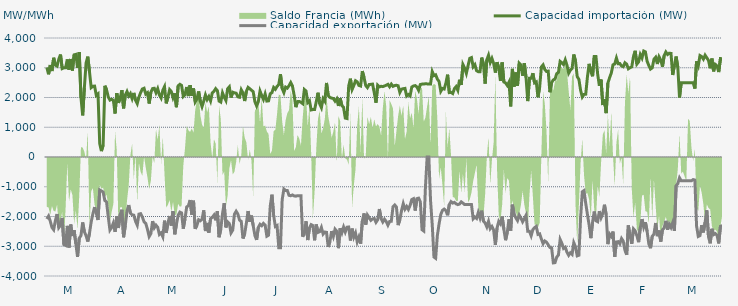
| Category | Capacidad importación (MW) | Capacidad exportación (MW) |
|---|---|---|
| 0 | 3009.542 | -2084.208 |
| 1900-01-01 | 2780.333 | -1987.25 |
| 1900-01-02 | 3090.792 | -2157.25 |
| 1900-01-03 | 2889.375 | -2369.167 |
| 1900-01-04 | 3335.375 | -2443.917 |
| 1900-01-05 | 3086.625 | -2135.417 |
| 1900-01-06 | 3054 | -1916.417 |
| 1900-01-07 | 3285.417 | -2373 |
| 1900-01-08 | 3443.292 | -2289.333 |
| 1900-01-09 | 2971.208 | -2047.917 |
| 1900-01-10 | 2996.292 | -2944.458 |
| 1900-01-11 | 3001.167 | -2971.542 |
| 1900-01-12 | 3281.375 | -2314.833 |
| 1900-01-13 | 2936.042 | -3043.167 |
| 1900-01-14 | 3294.792 | -2270.333 |
| 1900-01-15 | 2907.375 | -2657.667 |
| 1900-01-16 | 3433.583 | -2462.5 |
| 1900-01-17 | 3449.042 | -2914.583 |
| 1900-01-18 | 2992.458 | -3358.458 |
| 1900-01-19 | 3524.375 | -2728.208 |
| 1900-01-20 | 2000 | -2643.375 |
| 1900-01-21 | 1400 | -2200 |
| 1900-01-22 | 2323.375 | -2514.75 |
| 1900-01-23 | 3160.167 | -2645.333 |
| 1900-01-24 | 3372.083 | -2842.167 |
| 1900-01-25 | 2865.739 | -2564.565 |
| 1900-01-26 | 2332.667 | -2181.833 |
| 1900-01-27 | 2376.083 | -1906.25 |
| 1900-01-28 | 2381.25 | -1683.333 |
| 1900-01-29 | 2070.833 | -1891.667 |
| 1900-01-30 | 2120.083 | -2118.75 |
| 1900-01-31 | 449.25 | -1108.333 |
| 1900-02-01 | 200 | -1139.583 |
| 1900-02-02 | 395.833 | -1179.167 |
| 1900-02-03 | 2393.75 | -1462.5 |
| 1900-02-04 | 2262.25 | -1512.5 |
| 1900-02-05 | 2020.833 | -2007.167 |
| 1900-02-06 | 1912.5 | -2455.208 |
| 1900-02-07 | 1939.583 | -2371.125 |
| 1900-02-08 | 1908.333 | -2217.958 |
| 1900-02-09 | 1462.5 | -2517.542 |
| 1900-02-10 | 2145.208 | -2000.417 |
| 1900-02-11 | 1820.833 | -2386.167 |
| 1900-02-12 | 1983.333 | -1930.75 |
| 1900-02-13 | 2245.833 | -1772.917 |
| 1900-02-14 | 1635.417 | -2697.5 |
| 1900-02-15 | 2079.167 | -2299.625 |
| 1900-02-16 | 2200 | -1818.75 |
| 1900-02-17 | 2052.083 | -1616.667 |
| 1900-02-18 | 2133.333 | -1885.417 |
| 1900-02-19 | 1962.5 | -1940.792 |
| 1900-02-20 | 2154.167 | -1955.875 |
| 1900-02-21 | 1906.25 | -2160.458 |
| 1900-02-22 | 1791.667 | -2289.583 |
| 1900-02-23 | 2014.583 | -1920.333 |
| 1900-02-24 | 2166.667 | -1904.167 |
| 1900-02-25 | 2285.417 | -2016.25 |
| 1900-02-26 | 2310.417 | -2177.917 |
| 1900-02-27 | 2114.583 | -2230.875 |
| 1900-02-28 | 2160.417 | -2431.625 |
| 1900-02-28 | 1797.917 | -2674.417 |
| 1900-03-01 | 2180.625 | -2574 |
| 1900-03-02 | 2300 | -2155.333 |
| 1900-03-03 | 2310.417 | -2380.708 |
| 1900-03-04 | 2160.417 | -2290.5 |
| 1900-03-05 | 2295.833 | -2360.958 |
| 1900-03-06 | 2083.333 | -2603 |
| 1900-03-07 | 1983.333 | -2551.458 |
| 1900-03-08 | 2243.75 | -2680.375 |
| 1900-03-09 | 2364.583 | -2139.583 |
| 1900-03-10 | 1802.083 | -2551.375 |
| 1900-03-11 | 2012.5 | -2222.583 |
| 1900-03-12 | 2264.583 | -1983.333 |
| 1900-03-13 | 2200 | -2304.167 |
| 1900-03-14 | 1991.667 | -1823 |
| 1900-03-15 | 2139.583 | -2598.667 |
| 1900-03-16 | 1674.583 | -2262.5 |
| 1900-03-17 | 2391.667 | -1958.333 |
| 1900-03-18 | 2442.875 | -1852.083 |
| 1900-03-19 | 2406.25 | -1879.167 |
| 1900-03-20 | 2035.417 | -2408.5 |
| 1900-03-21 | 2093.75 | -2077.083 |
| 1900-03-22 | 2353.042 | -1679.167 |
| 1900-03-23 | 2047.917 | -1637.5 |
| 1900-03-24 | 2414.917 | -1445.833 |
| 1900-03-25 | 2054.167 | -1935.417 |
| 1900-03-26 | 2304.167 | -1468.75 |
| 1900-03-27 | 1852.083 | -2413.583 |
| 1900-03-28 | 1950 | -2298.583 |
| 1900-03-29 | 2204.167 | -2108.333 |
| 1900-03-30 | 1870.833 | -2142.875 |
| 1900-03-31 | 1693.75 | -2094.083 |
| 1900-04-01 | 1875 | -1793.75 |
| 1900-04-02 | 2087.5 | -2489.25 |
| 1900-04-03 | 1929.167 | -2216.167 |
| 1900-04-04 | 2031.25 | -2542 |
| 1900-04-05 | 1885.417 | -2072.833 |
| 1900-04-06 | 2156.25 | -2029.167 |
| 1900-04-07 | 2208.333 | -1953 |
| 1900-04-08 | 2297.917 | -2127.083 |
| 1900-04-09 | 2229.167 | -1822.917 |
| 1900-04-10 | 1879.167 | -2695.583 |
| 1900-04-11 | 1845.833 | -2427.667 |
| 1900-04-12 | 2156.25 | -1908.417 |
| 1900-04-13 | 2010.417 | -1551.375 |
| 1900-04-14 | 1897.625 | -2367.333 |
| 1900-04-15 | 2291.667 | -2179.167 |
| 1900-04-16 | 2358.333 | -2236.833 |
| 1900-04-17 | 1997.917 | -2551.708 |
| 1900-04-18 | 2179.167 | -2457.875 |
| 1900-04-19 | 2156.25 | -1922.667 |
| 1900-04-20 | 2145.833 | -1823.917 |
| 1900-04-21 | 2022.917 | -1916.417 |
| 1900-04-22 | 2008.333 | -2121.167 |
| 1900-04-23 | 2260.417 | -2164.667 |
| 1900-04-24 | 2152.083 | -2739.958 |
| 1900-04-25 | 1881 | -2582.833 |
| 1900-04-26 | 2206.25 | -2222.083 |
| 1900-04-27 | 2339.583 | -1816.667 |
| 1900-04-28 | 2293.75 | -2177.833 |
| 1900-04-29 | 2245.833 | -1968.75 |
| 1900-04-30 | 2195.833 | -2304.458 |
| 1900-05-01 | 1858.208 | -2638.917 |
| 1900-05-02 | 1718.75 | -2788.083 |
| 1900-05-03 | 1858.333 | -2369.542 |
| 1900-05-04 | 2216.667 | -2260.583 |
| 1900-05-05 | 2066.667 | -2309.375 |
| 1900-05-06 | 1935.417 | -2231 |
| 1900-05-07 | 2118.292 | -2285.25 |
| 1900-05-08 | 1879.583 | -2663 |
| 1900-05-09 | 1887.5 | -2627.5 |
| 1900-05-10 | 2127.083 | -1647.917 |
| 1900-05-11 | 2162.5 | -1266.667 |
| 1900-05-12 | 2338.667 | -1964.583 |
| 1900-05-13 | 2277.083 | -2337.25 |
| 1900-05-14 | 2373.75 | -2304.167 |
| 1900-05-15 | 2435.083 | -3048.333 |
| 1900-05-16 | 2780.708 | -3048.208 |
| 1900-05-17 | 2300 | -1435 |
| 1900-05-18 | 2164.583 | -1077.083 |
| 1900-05-19 | 2350 | -1125 |
| 1900-05-20 | 2314.583 | -1125 |
| 1900-05-21 | 2395.625 | -1287.5 |
| 1900-05-22 | 2501.583 | -1302.083 |
| 1900-05-23 | 2389.417 | -1275 |
| 1900-05-24 | 2080.375 | -1308.333 |
| 1900-05-25 | 1675 | -1316.667 |
| 1900-05-26 | 1862.5 | -1300 |
| 1900-05-27 | 1866.708 | -1300 |
| 1900-05-28 | 1837.292 | -1300 |
| 1900-05-29 | 1793.75 | -2680.333 |
| 1900-05-30 | 2268.333 | -2563.75 |
| 1900-05-31 | 2217.333 | -2160.333 |
| 1900-06-01 | 1831.25 | -2791.75 |
| 1900-06-02 | 1890.083 | -2386.583 |
| 1900-06-03 | 1581.667 | -2273.25 |
| 1900-06-04 | 1595.833 | -2304.167 |
| 1900-06-05 | 1593.75 | -2799.042 |
| 1900-06-06 | 1860.75 | -2268.667 |
| 1900-06-07 | 2160.5 | -2533.875 |
| 1900-06-08 | 1785.417 | -2508.667 |
| 1900-06-09 | 1658.333 | -2368.167 |
| 1900-06-10 | 1958.333 | -2590.5 |
| 1900-06-11 | 1875.083 | -2522 |
| 1900-06-12 | 2489.792 | -2532.75 |
| 1900-06-13 | 2064.583 | -3024.833 |
| 1900-06-14 | 2001.333 | -2838.125 |
| 1900-06-15 | 1979.167 | -2490.417 |
| 1900-06-16 | 1966.667 | -2671.375 |
| 1900-06-17 | 1877.792 | -2424.333 |
| 1900-06-18 | 1957.75 | -2493.167 |
| 1900-06-19 | 1716.667 | -3063.708 |
| 1900-06-20 | 1978.5 | -2394.708 |
| 1900-06-21 | 1729.167 | -2549 |
| 1900-06-22 | 1666.667 | -2355.5 |
| 1900-06-23 | 1308.333 | -2520.458 |
| 1900-06-24 | 1293.75 | -2359.417 |
| 1900-06-25 | 2383.833 | -2353.167 |
| 1900-06-26 | 2632.25 | -2807.083 |
| 1900-06-27 | 2269.167 | -2407.042 |
| 1900-06-28 | 2400.75 | -2695.042 |
| 1900-06-29 | 2564.417 | -2553.583 |
| 1900-06-30 | 2525.583 | -2853.583 |
| 1900-07-01 | 2404.5 | -2690.292 |
| 1900-07-02 | 2386.042 | -2912.083 |
| 1900-07-03 | 2890.042 | -2155.708 |
| 1900-07-04 | 2668.625 | -1896.5 |
| 1900-07-05 | 2403.083 | -2272.75 |
| 1900-07-06 | 2332.833 | -1950 |
| 1900-07-07 | 2437.5 | -2037.5 |
| 1900-07-08 | 2441.667 | -2129 |
| 1900-07-09 | 2450 | -2079.167 |
| 1900-07-10 | 2159.292 | -2066.667 |
| 1900-07-11 | 1825 | -2195.667 |
| 1900-07-12 | 2412.5 | -2108.333 |
| 1900-07-13 | 2355.5 | -1747.917 |
| 1900-07-14 | 2377.083 | -2070.833 |
| 1900-07-15 | 2366.667 | -2185.333 |
| 1900-07-16 | 2387.5 | -2091.667 |
| 1900-07-17 | 2412.5 | -2164.583 |
| 1900-07-18 | 2443 | -2291.292 |
| 1900-07-19 | 2360.417 | -2168.75 |
| 1900-07-20 | 2450 | -2160.417 |
| 1900-07-21 | 2375 | -1668.75 |
| 1900-07-22 | 2402.083 | -1612.5 |
| 1900-07-23 | 2412 | -1683.333 |
| 1900-07-24 | 2393.75 | -2289.583 |
| 1900-07-25 | 2168.625 | -2114.083 |
| 1900-07-26 | 2281.25 | -1800 |
| 1900-07-27 | 2295.833 | -1566.667 |
| 1900-07-28 | 2306.25 | -1754.167 |
| 1900-07-29 | 2050 | -1662.5 |
| 1900-07-30 | 2100 | -1762.5 |
| 1900-07-31 | 2052.083 | -1629.167 |
| 1900-08-01 | 2351.708 | -1429.167 |
| 1900-08-02 | 2387.5 | -1400 |
| 1900-08-03 | 2400 | -1800 |
| 1900-08-04 | 2355.875 | -1400 |
| 1900-08-05 | 2239.583 | -1383.333 |
| 1900-08-06 | 2435.417 | -1500 |
| 1900-08-07 | 2450 | -2442.875 |
| 1900-08-08 | 2455.875 | -2487.042 |
| 1900-08-09 | 2459.792 | -1025 |
| 1900-08-10 | 2457.708 | 0 |
| 1900-08-11 | 2450 | 0 |
| 1900-08-12 | 2450 | -1462.5 |
| 1900-08-13 | 2870.833 | -2280.5 |
| 1900-08-14 | 2735.958 | -3362.458 |
| 1900-08-15 | 2761.833 | -3404.708 |
| 1900-08-16 | 2618.708 | -2638.958 |
| 1900-08-17 | 2538.583 | -2247.25 |
| 1900-08-18 | 2208.333 | -1933.333 |
| 1900-08-19 | 2304.167 | -1791.667 |
| 1900-08-20 | 2285.083 | -1750 |
| 1900-08-21 | 2485.708 | -1800 |
| 1900-08-22 | 2766.917 | -1958.333 |
| 1900-08-23 | 2164.458 | -1600 |
| 1900-08-24 | 2172.792 | -1500 |
| 1900-08-25 | 2133.333 | -1550 |
| 1900-08-26 | 2297.917 | -1525 |
| 1900-08-27 | 2366.667 | -1575 |
| 1900-08-28 | 2243.25 | -1600 |
| 1900-08-29 | 2598.52 | -1580 |
| 1900-08-30 | 2420.167 | -1508.333 |
| 1900-08-31 | 3106.25 | -1550 |
| 1900-09-01 | 2984.667 | -1600 |
| 1900-09-02 | 2812.083 | -1600 |
| 1900-09-03 | 3067.5 | -1600 |
| 1900-09-04 | 3316.25 | -1600 |
| 1900-09-05 | 3341.25 | -1600 |
| 1900-09-06 | 3032 | -2077.083 |
| 1900-09-07 | 3104.417 | -2016.75 |
| 1900-09-08 | 2900 | -2064.583 |
| 1900-09-09 | 2867 | -1862.5 |
| 1900-09-10 | 2867 | -2045.833 |
| 1900-09-11 | 3341.083 | -1804.167 |
| 1900-09-12 | 3131.083 | -2154.167 |
| 1900-09-13 | 2468.083 | -2216.667 |
| 1900-09-14 | 3265.167 | -2350 |
| 1900-09-15 | 3420.583 | -2164.833 |
| 1900-09-16 | 3174.333 | -2409.417 |
| 1900-09-17 | 3313.292 | -2335.75 |
| 1900-09-18 | 3146.333 | -2455.542 |
| 1900-09-19 | 2838 | -2955.75 |
| 1900-09-20 | 3188.5 | -2388.25 |
| 1900-09-21 | 2992.083 | -2162.5 |
| 1900-09-22 | 2556.125 | -2248.583 |
| 1900-09-23 | 3177.25 | -2002.917 |
| 1900-09-24 | 2521.083 | -2429.667 |
| 1900-09-25 | 2489.167 | -2797.208 |
| 1900-09-26 | 2404.583 | -2531.417 |
| 1900-09-27 | 2519.708 | -2094.75 |
| 1900-09-28 | 1700 | -2472.792 |
| 1900-09-29 | 2961.583 | -1602.083 |
| 1900-09-30 | 2367.125 | -1916.667 |
| 1900-10-01 | 2839.792 | -2043.75 |
| 1900-10-02 | 2395.833 | -2137.5 |
| 1900-10-03 | 3152.583 | -1952.083 |
| 1900-10-04 | 3090.75 | -2052.083 |
| 1900-10-05 | 2732.167 | -2177.083 |
| 1900-10-06 | 3154.208 | -2069.625 |
| 1900-10-07 | 2672.375 | -1960.417 |
| 1900-10-08 | 1879.167 | -2497 |
| 1900-10-09 | 2643.583 | -2497 |
| 1900-10-10 | 2643.083 | -2647.583 |
| 1900-10-11 | 2816.917 | -2441.083 |
| 1900-10-12 | 2493.125 | -2374 |
| 1900-10-13 | 2524.458 | -2332.167 |
| 1900-10-14 | 2008.333 | -2601 |
| 1900-10-15 | 2361.875 | -2582.083 |
| 1900-10-16 | 3027.625 | -2755.833 |
| 1900-10-17 | 3096.375 | -2911.667 |
| 1900-10-18 | 2940.417 | -2822.917 |
| 1900-10-19 | 2875 | -2863.5 |
| 1900-10-20 | 2886.833 | -2951.167 |
| 1900-10-21 | 2177.083 | -3040.5 |
| 1900-10-22 | 2503.583 | -3052 |
| 1900-10-23 | 2591.792 | -3558.75 |
| 1900-10-24 | 2617 | -3551.083 |
| 1900-10-25 | 2801.958 | -3364.542 |
| 1900-10-26 | 2846.25 | -3293 |
| 1900-10-27 | 3214.542 | -2770.875 |
| 1900-10-28 | 3169.167 | -2897.917 |
| 1900-10-29 | 3108.042 | -3073.375 |
| 1900-10-30 | 3266.042 | -3032.75 |
| 1900-10-31 | 3083.708 | -3200.292 |
| 1900-11-01 | 2817.875 | -3304.5 |
| 1900-11-02 | 2919.708 | -3219.583 |
| 1900-11-03 | 2976.042 | -3273.667 |
| 1900-11-04 | 3445.625 | -2880.583 |
| 1900-11-05 | 3231.042 | -3016.625 |
| 1900-11-06 | 2703.75 | -3322.875 |
| 1900-11-07 | 2610.417 | -3303 |
| 1900-11-08 | 2240.75 | -2035 |
| 1900-11-09 | 2016.667 | -1167.583 |
| 1900-11-10 | 2102.083 | -1128.25 |
| 1900-11-11 | 2110.417 | -1558.333 |
| 1900-11-12 | 2691.083 | -1930.667 |
| 1900-11-13 | 3131 | -2286.417 |
| 1900-11-14 | 2867 | -2728 |
| 1900-11-15 | 2713.167 | -2194.5 |
| 1900-11-16 | 3375.5 | -1833.333 |
| 1900-11-17 | 3377.833 | -2144.5 |
| 1900-11-18 | 2788.375 | -2175 |
| 1900-11-19 | 2393.917 | -1818.5 |
| 1900-11-20 | 2602.208 | -2041.542 |
| 1900-11-21 | 1745.833 | -1898.542 |
| 1900-11-22 | 1941.667 | -1603.542 |
| 1900-11-23 | 1475 | -1942.833 |
| 1900-11-24 | 2488.208 | -2928.792 |
| 1900-11-25 | 2665.583 | -2587.083 |
| 1900-11-26 | 2824.833 | -2666.708 |
| 1900-11-27 | 3099 | -2507.042 |
| 1900-11-28 | 3125.208 | -3352.792 |
| 1900-11-29 | 3325.625 | -2855.792 |
| 1900-11-30 | 3135.042 | -2844.083 |
| 1900-12-01 | 3141.667 | -2918 |
| 1900-12-02 | 3059.917 | -2739.5 |
| 1900-12-03 | 3034.833 | -2828 |
| 1900-12-04 | 3167.5 | -3136.792 |
| 1900-12-05 | 3121.167 | -3287.208 |
| 1900-12-06 | 2964.583 | -2300 |
| 1900-12-07 | 3002.167 | -2654.417 |
| 1900-12-08 | 3029.042 | -2917.583 |
| 1900-12-09 | 3379.625 | -2416.083 |
| 1900-12-10 | 3570.333 | -2480.292 |
| 1900-12-11 | 3123.292 | -2647.208 |
| 1900-12-12 | 3196.583 | -2862.417 |
| 1900-12-13 | 3445.458 | -2378.958 |
| 1900-12-14 | 3328.083 | -2087.5 |
| 1900-12-15 | 3561 | -2358.667 |
| 1900-12-16 | 3532.125 | -2190.458 |
| 1900-12-17 | 3219.792 | -2497 |
| 1900-12-18 | 3077.292 | -2917.833 |
| 1900-12-19 | 2955.75 | -3065.375 |
| 1900-12-20 | 2997.958 | -2665.292 |
| 1900-12-21 | 3285.292 | -2594.75 |
| 1900-12-22 | 3350.708 | -2217.75 |
| 1900-12-23 | 3125.292 | -2661.542 |
| 1900-12-24 | 3368.292 | -2470.583 |
| 1900-12-25 | 3260.167 | -2844.375 |
| 1900-12-26 | 3034.708 | -2450.625 |
| 1900-12-27 | 3410.458 | -2385 |
| 1900-12-28 | 3529.958 | -2146.167 |
| 1900-12-29 | 3445.25 | -2443.125 |
| 1900-12-30 | 3489.542 | -2260.25 |
| 1900-12-31 | 3481.833 | -2370.583 |
| 1901-01-01 | 2757.125 | -2206.25 |
| 1901-01-02 | 3080.958 | -2481.667 |
| 1901-01-03 | 3376 | -966.667 |
| 1901-01-04 | 3018.208 | -895.833 |
| 1901-01-05 | 2000 | -700 |
| 1901-01-06 | 2497 | -800 |
| 1901-01-07 | 2497 | -800 |
| 1901-01-08 | 2497 | -800 |
| 1901-01-09 | 2497 | -800 |
| 1901-01-10 | 2497 | -800 |
| 1901-01-11 | 2497 | -800 |
| 1901-01-12 | 2497 | -800 |
| 1901-01-13 | 2497 | -758.333 |
| 1901-01-14 | 2300 | -775 |
| 1901-01-15 | 3213.417 | -2319.542 |
| 1901-01-16 | 3069.417 | -2670.458 |
| 1901-01-17 | 3409.708 | -2642.25 |
| 1901-01-18 | 3375.792 | -2289.292 |
| 1901-01-19 | 3289.583 | -2534.75 |
| 1901-01-20 | 3422.208 | -2195.833 |
| 1901-01-21 | 3333.625 | -1791.167 |
| 1901-01-22 | 3246.917 | -2683.292 |
| 1901-01-23 | 2982.792 | -2900.958 |
| 1901-01-24 | 3308.458 | -2412.833 |
| 1901-01-25 | 2878.875 | -2610.083 |
| 1901-01-26 | 3112.042 | -2575.917 |
| 1901-01-27 | 3061.417 | -2634.458 |
| 1901-01-28 | 2855.167 | -2904.792 |
| 1901-01-29 | 3308.833 | -2329.167 |
| 1901-01-30 | 3303.652 | -2303.826 |